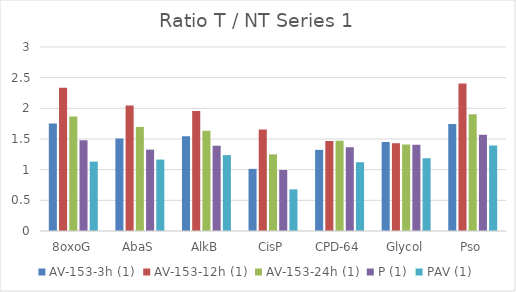
| Category | AV-153-3h (1) | AV-153-12h (1) | AV-153-24h (1) | P (1) | PAV (1) |
|---|---|---|---|---|---|
| 8oxoG | 1.753 | 2.336 | 1.867 | 1.478 | 1.131 |
| AbaS | 1.509 | 2.047 | 1.695 | 1.327 | 1.165 |
| AlkB | 1.543 | 1.958 | 1.633 | 1.388 | 1.238 |
| CisP | 1.013 | 1.655 | 1.249 | 0.995 | 0.679 |
| CPD-64 | 1.323 | 1.466 | 1.472 | 1.365 | 1.122 |
| Glycol | 1.451 | 1.429 | 1.409 | 1.406 | 1.186 |
| Pso | 1.744 | 2.406 | 1.902 | 1.57 | 1.392 |